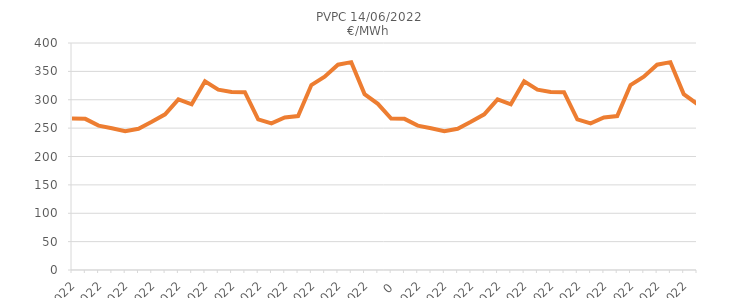
| Category | PVPC 14/06/2022
€/MWh |
|---|---|
| 44562.0 | 266.95 |
| 44563.0 | 266.34 |
| 44564.0 | 254.41 |
| 44565.0 | 249.73 |
| 44566.0 | 244.74 |
| 44567.0 | 248.96 |
| 44568.0 | 261.12 |
| 44569.0 | 274.29 |
| 44570.0 | 300.68 |
| 44571.0 | 291.95 |
| 44572.0 | 332.44 |
| 44573.0 | 317.75 |
| 44574.0 | 313.79 |
| 44575.0 | 313.36 |
| 44576.0 | 265.42 |
| 44577.0 | 258.4 |
| 44578.0 | 268.77 |
| 44579.0 | 271.23 |
| 44580.0 | 325.92 |
| 44581.0 | 340.65 |
| 44582.0 | 361.8 |
| 44583.0 | 366.25 |
| 44584.0 | 309.93 |
| 44585.0 | 292.87 |
| 44561.0 | 266.95 |
| 44562.0 | 266.34 |
| 44563.0 | 254.41 |
| 44564.0 | 249.73 |
| 44565.0 | 244.74 |
| 44566.0 | 248.96 |
| 44567.0 | 261.12 |
| 44568.0 | 274.29 |
| 44569.0 | 300.68 |
| 44570.0 | 291.95 |
| 44571.0 | 332.44 |
| 44572.0 | 317.75 |
| 44573.0 | 313.79 |
| 44574.0 | 313.36 |
| 44575.0 | 265.42 |
| 44576.0 | 258.4 |
| 44577.0 | 268.77 |
| 44578.0 | 271.23 |
| 44579.0 | 325.92 |
| 44580.0 | 340.65 |
| 44581.0 | 361.8 |
| 44582.0 | 366.25 |
| 44583.0 | 309.93 |
| 44584.0 | 292.87 |